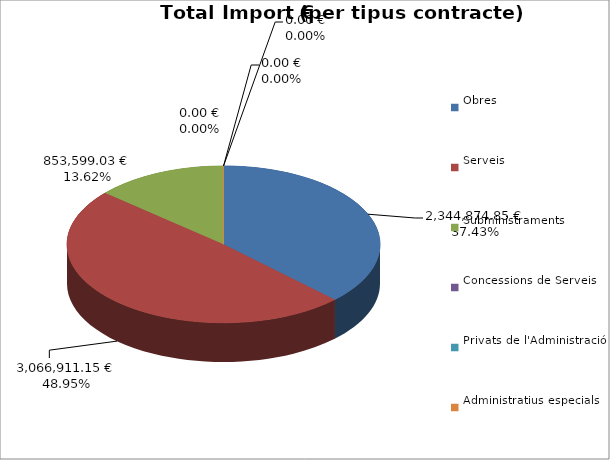
| Category | Total preu
(amb IVA) |
|---|---|
| Obres | 2344874.85 |
| Serveis | 3066911.15 |
| Subministraments | 853599.03 |
| Concessions de Serveis | 0 |
| Privats de l'Administració | 0 |
| Administratius especials | 0 |